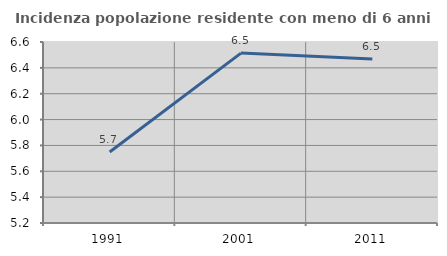
| Category | Incidenza popolazione residente con meno di 6 anni |
|---|---|
| 1991.0 | 5.749 |
| 2001.0 | 6.514 |
| 2011.0 | 6.469 |